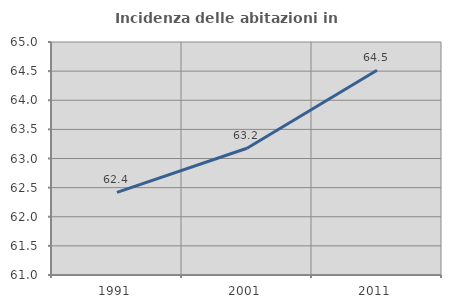
| Category | Incidenza delle abitazioni in proprietà  |
|---|---|
| 1991.0 | 62.419 |
| 2001.0 | 63.176 |
| 2011.0 | 64.515 |